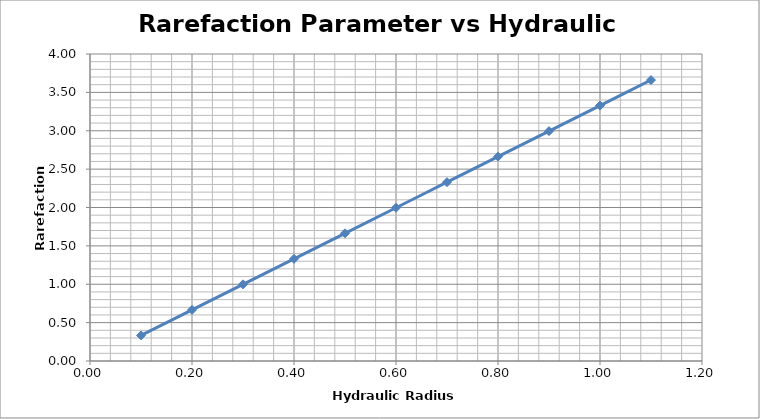
| Category | Series 0 |
|---|---|
| 0.1 | 0.333 |
| 0.2 | 0.666 |
| 0.3 | 0.998 |
| 0.4 | 1.331 |
| 0.5 | 1.664 |
| 0.6 | 1.997 |
| 0.7 | 2.33 |
| 0.8 | 2.662 |
| 0.9 | 2.995 |
| 1.0 | 3.328 |
| 1.1 | 3.661 |